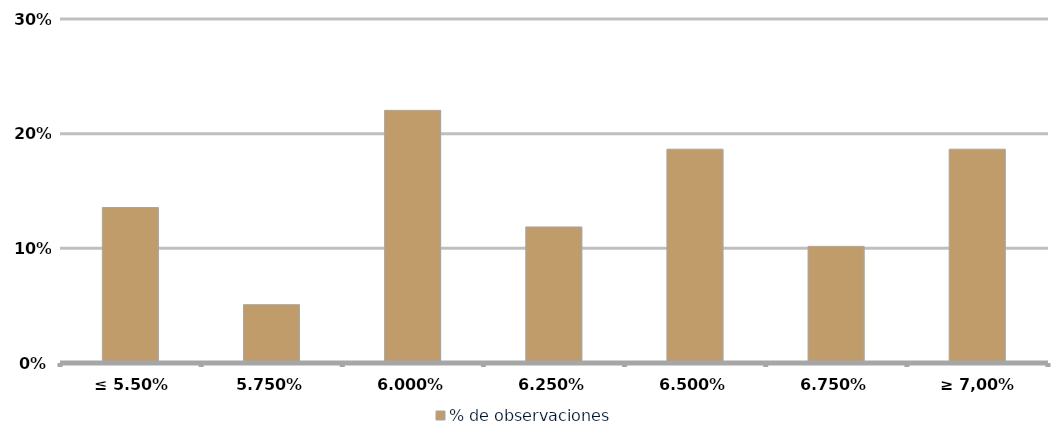
| Category | % de observaciones  |
|---|---|
| ≤ 5.50% | 0.136 |
| 5.75% | 0.051 |
| 6.00% | 0.22 |
| 6.25% | 0.119 |
| 6.50% | 0.186 |
| 6.75% | 0.102 |
| ≥ 7,00% | 0.186 |